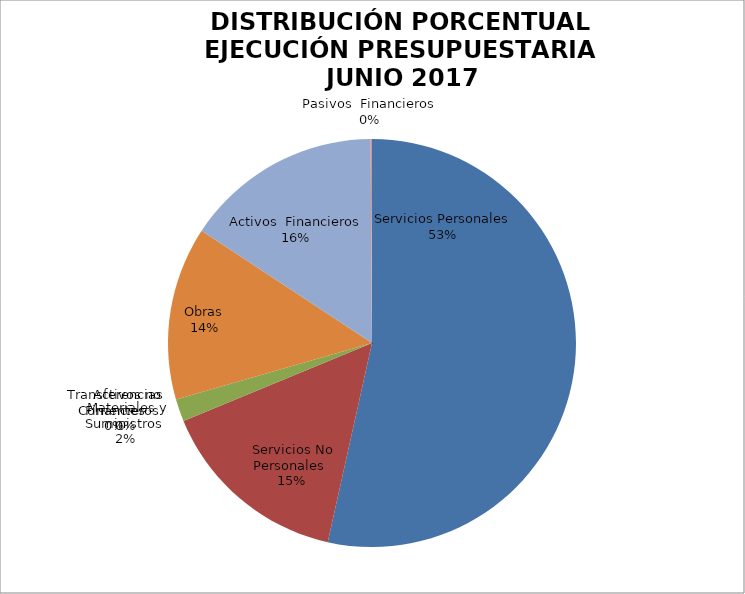
| Category | Series 0 | Series 1 |
|---|---|---|
| Servicios Personales | 11135563.91 | 0.778 |
| Servicios No Personales | 3180137.94 | 0.222 |
| Materiales y Suministros | 368742.1 | 0.026 |
| Transferencias Corrientes | 0 | 0 |
| Activos no Financieros | 0 | 0 |
| Obras | 2860161.7 | 0.049 |
| Activos  Financieros | -3253036.11 | -0.227 |
| Pasivos  Financieros | 22400 | 0.002 |